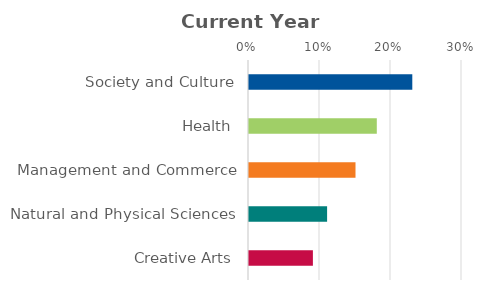
| Category | Series 0 |
|---|---|
| Society and Culture | 0.23 |
| Health | 0.18 |
| Management and Commerce | 0.15 |
| Natural and Physical Sciences | 0.11 |
| Creative Arts | 0.09 |